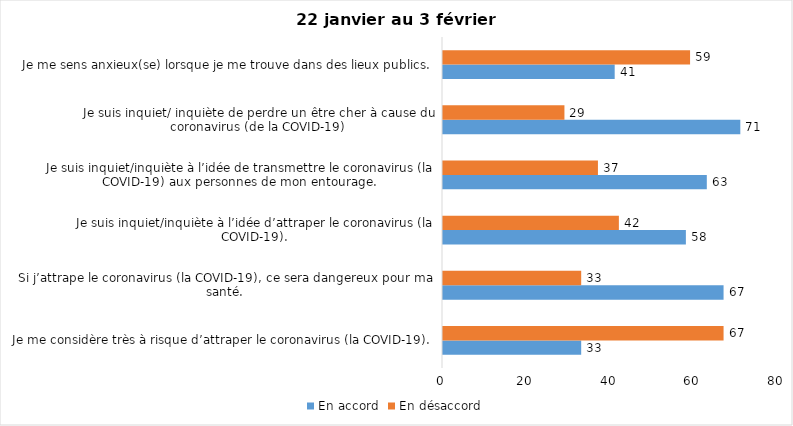
| Category | En accord | En désaccord |
|---|---|---|
| Je me considère très à risque d’attraper le coronavirus (la COVID-19). | 33 | 67 |
| Si j’attrape le coronavirus (la COVID-19), ce sera dangereux pour ma santé. | 67 | 33 |
| Je suis inquiet/inquiète à l’idée d’attraper le coronavirus (la COVID-19). | 58 | 42 |
| Je suis inquiet/inquiète à l’idée de transmettre le coronavirus (la COVID-19) aux personnes de mon entourage. | 63 | 37 |
| Je suis inquiet/ inquiète de perdre un être cher à cause du coronavirus (de la COVID-19) | 71 | 29 |
| Je me sens anxieux(se) lorsque je me trouve dans des lieux publics. | 41 | 59 |